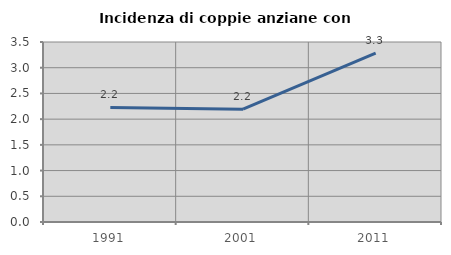
| Category | Incidenza di coppie anziane con figli |
|---|---|
| 1991.0 | 2.228 |
| 2001.0 | 2.194 |
| 2011.0 | 3.285 |